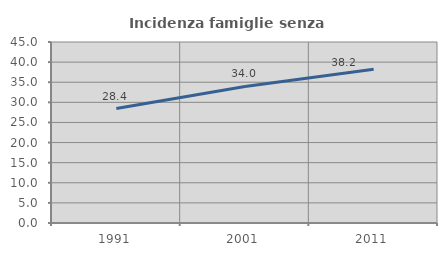
| Category | Incidenza famiglie senza nuclei |
|---|---|
| 1991.0 | 28.444 |
| 2001.0 | 33.951 |
| 2011.0 | 38.242 |